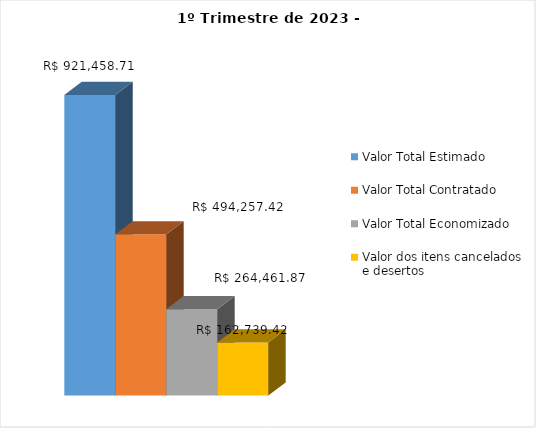
| Category | Valor Total Estimado | Valor Total Contratado | Valor Total Economizado | Valor dos itens cancelados e desertos |
|---|---|---|---|---|
| 0 | 921458.71 | 494257.42 | 264461.87 | 162739.42 |